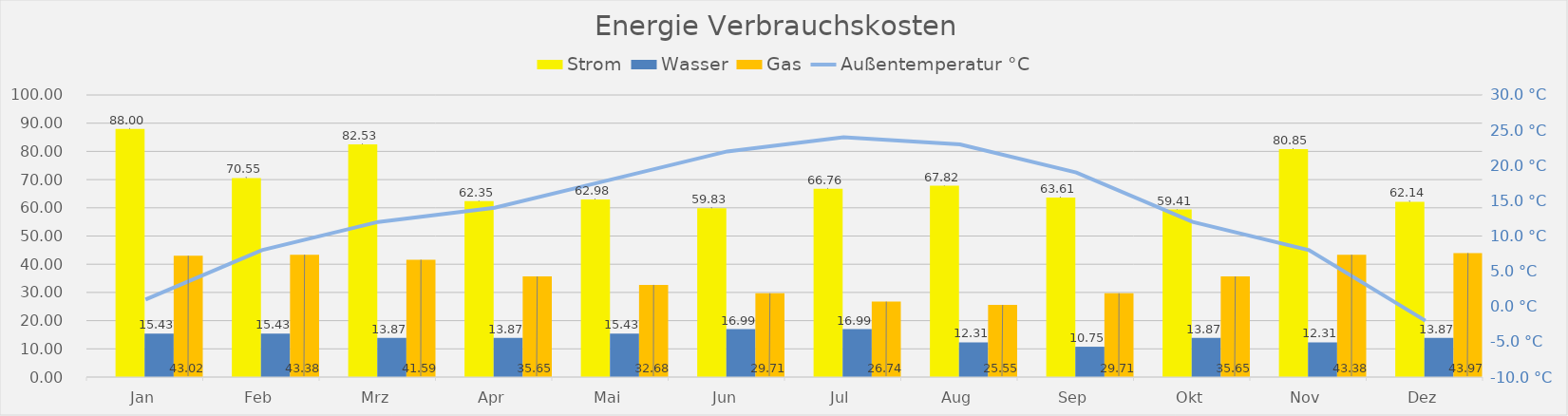
| Category | Series 0 | Strom | Wasser | Gas |
|---|---|---|---|---|
| Jan |  | 87.998 | 15.43 | 43.02 |
| Feb |  | 70.549 | 15.43 | 43.377 |
| Mrz |  | 82.532 | 13.87 | 41.594 |
| Apr |  | 62.35 | 13.87 | 35.652 |
| Mai |  | 62.98 | 15.43 | 32.681 |
| Jun |  | 59.827 | 16.99 | 29.71 |
| Jul |  | 66.764 | 16.99 | 26.739 |
| Aug |  | 67.816 | 12.31 | 25.551 |
| Sep |  | 63.611 | 10.75 | 29.71 |
| Okt |  | 59.406 | 13.87 | 35.652 |
| Nov |  | 80.85 | 12.31 | 43.377 |
| Dez |  | 62.139 | 13.87 | 43.971 |